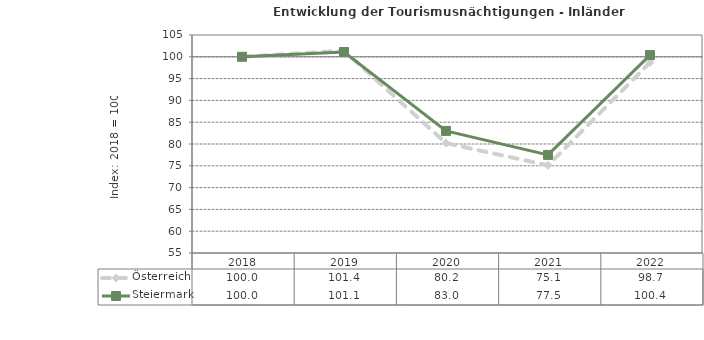
| Category | Österreich | Steiermark |
|---|---|---|
| 2022.0 | 98.7 | 100.4 |
| 2021.0 | 75.1 | 77.5 |
| 2020.0 | 80.2 | 83 |
| 2019.0 | 101.4 | 101.1 |
| 2018.0 | 100 | 100 |